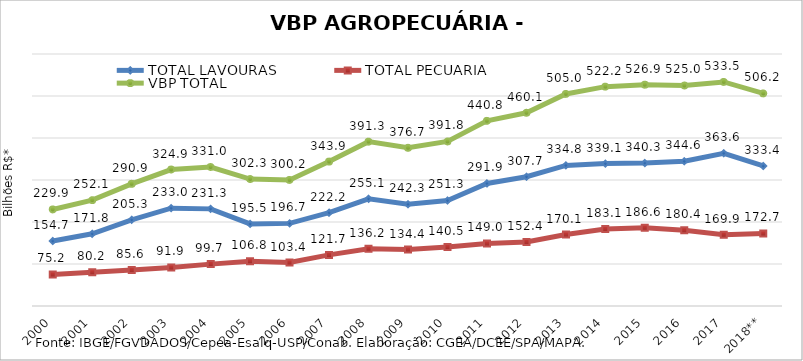
| Category | TOTAL LAVOURAS | TOTAL PECUÁRIA | VBP TOTAL |
|---|---|---|---|
| 2000 | 154.694 | 75.195 | 229.89 |
| 2001 | 171.837 | 80.224 | 252.061 |
| 2002 | 205.265 | 85.64 | 290.905 |
| 2003 | 232.974 | 91.919 | 324.894 |
| 2004 | 231.269 | 99.706 | 330.975 |
| 2005 | 195.527 | 106.809 | 302.337 |
| 2006 | 196.722 | 103.446 | 300.168 |
| 2007 | 222.161 | 121.699 | 343.86 |
| 2008 | 255.096 | 136.21 | 391.306 |
| 2009 | 242.307 | 134.438 | 376.746 |
| 2010 | 251.3 | 140.462 | 391.762 |
| 2011 | 291.853 | 148.994 | 440.848 |
| 2012 | 307.724 | 152.412 | 460.136 |
| 2013 | 334.806 | 170.15 | 504.955 |
| 2014 | 339.113 | 183.129 | 522.243 |
| 2015 | 340.344 | 186.559 | 526.903 |
| 2016 | 344.648 | 180.356 | 525.003 |
| 2017 | 363.588 | 169.933 | 533.521 |
| 2018** | 333.425 | 172.731 | 506.156 |